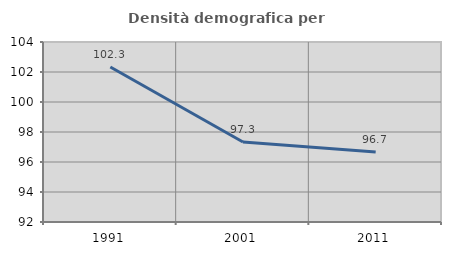
| Category | Densità demografica |
|---|---|
| 1991.0 | 102.331 |
| 2001.0 | 97.336 |
| 2011.0 | 96.665 |